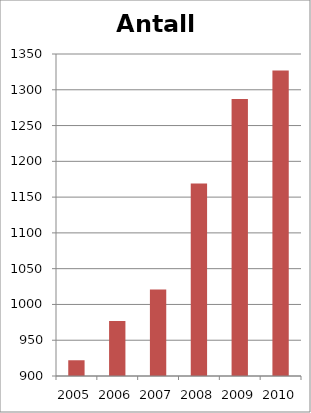
| Category | Forbrytelser |
|---|---|
| 2005.0 | 922 |
| 2006.0 | 977 |
| 2007.0 | 1021 |
| 2008.0 | 1169 |
| 2009.0 | 1287 |
| 2010.0 | 1327 |